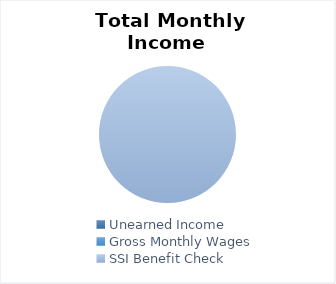
| Category | Total Monthly Income (Before Taxes) |
|---|---|
| 0 | 0 |
| 1 | 0 |
| 2 | 750 |